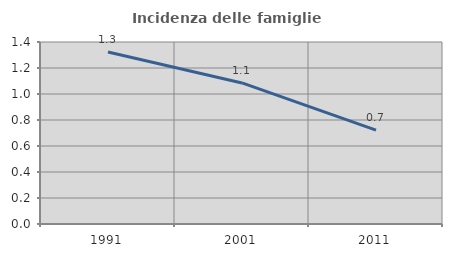
| Category | Incidenza delle famiglie numerose |
|---|---|
| 1991.0 | 1.323 |
| 2001.0 | 1.085 |
| 2011.0 | 0.723 |